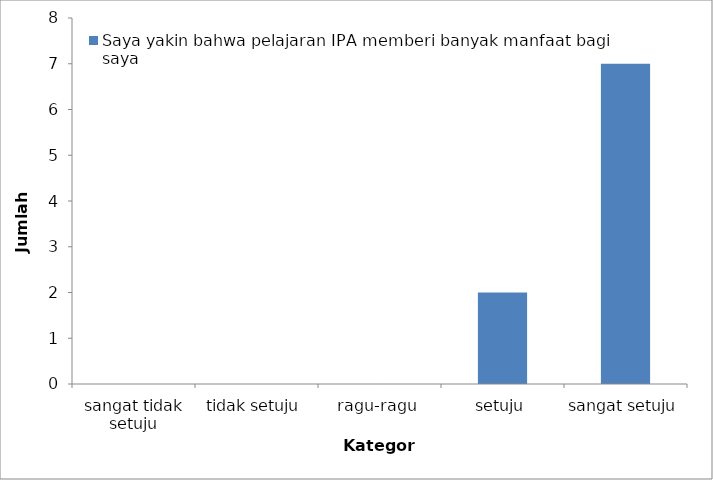
| Category | Saya yakin bahwa pelajaran IPA memberi banyak manfaat bagi saya |
|---|---|
| sangat tidak setuju | 0 |
| tidak setuju | 0 |
| ragu-ragu | 0 |
| setuju | 2 |
| sangat setuju | 7 |